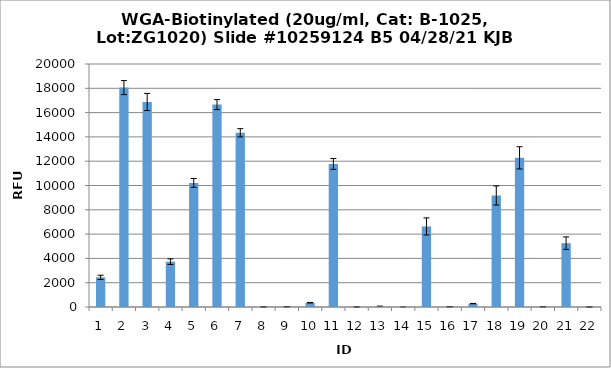
| Category | Series 0 |
|---|---|
| 0 | 2440.25 |
| 1 | 18056.75 |
| 2 | 16875 |
| 3 | 3731.5 |
| 4 | 10211.5 |
| 5 | 16659 |
| 6 | 14339.75 |
| 7 | 6.5 |
| 8 | 20.75 |
| 9 | 353 |
| 10 | 11776.75 |
| 11 | -1 |
| 12 | 27.25 |
| 13 | 2.25 |
| 14 | 6631.25 |
| 15 | 19.5 |
| 16 | 281.25 |
| 17 | 9179.25 |
| 18 | 12275.25 |
| 19 | 16.5 |
| 20 | 5254.75 |
| 21 | -0.5 |